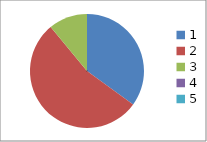
| Category | Series 0 |
|---|---|
| 0 | 0.35 |
| 1 | 0.54 |
| 2 | 0.11 |
| 3 | 0 |
| 4 | 0 |